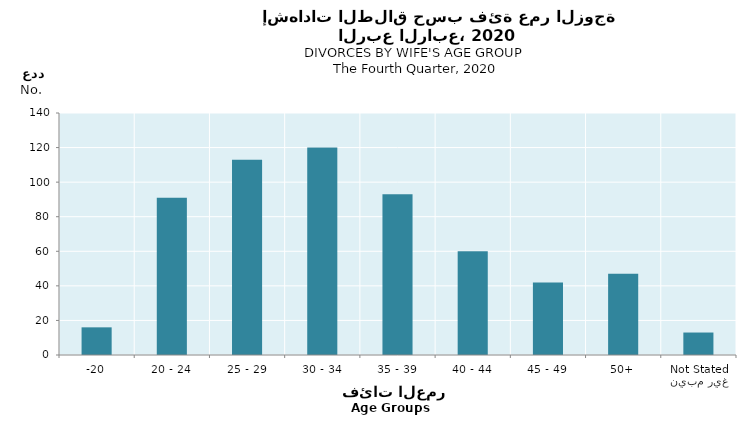
| Category | Series 0 |
|---|---|
| -20 | 16 |
| 20 - 24 | 91 |
| 25 - 29 | 113 |
| 30 - 34 | 120 |
| 35 - 39 | 93 |
| 40 - 44 | 60 |
| 45 - 49 | 42 |
| 50+ | 47 |
| غير مبين
Not Stated | 13 |